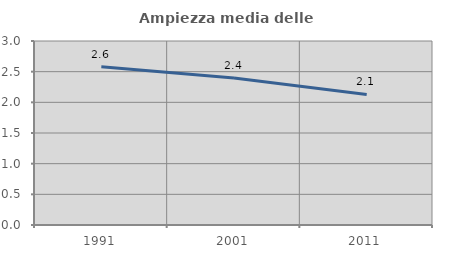
| Category | Ampiezza media delle famiglie |
|---|---|
| 1991.0 | 2.579 |
| 2001.0 | 2.397 |
| 2011.0 | 2.128 |